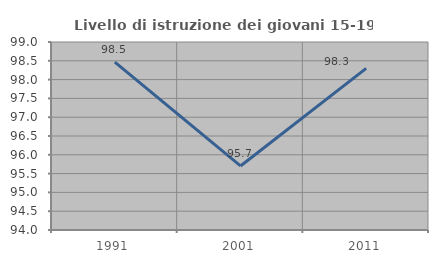
| Category | Livello di istruzione dei giovani 15-19 anni |
|---|---|
| 1991.0 | 98.466 |
| 2001.0 | 95.703 |
| 2011.0 | 98.299 |